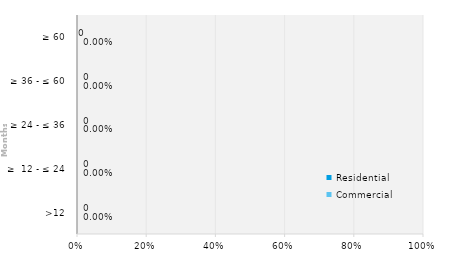
| Category | Commercial | Residential |
|---|---|---|
| >12 | 0 | 0 |
| ≥  12 - ≤ 24 | 0 | 0 |
| ≥ 24 - ≤ 36 | 0 | 0 |
| ≥ 36 - ≤ 60 | 0 | 0 |
| ≥ 60 | 0 | 0 |